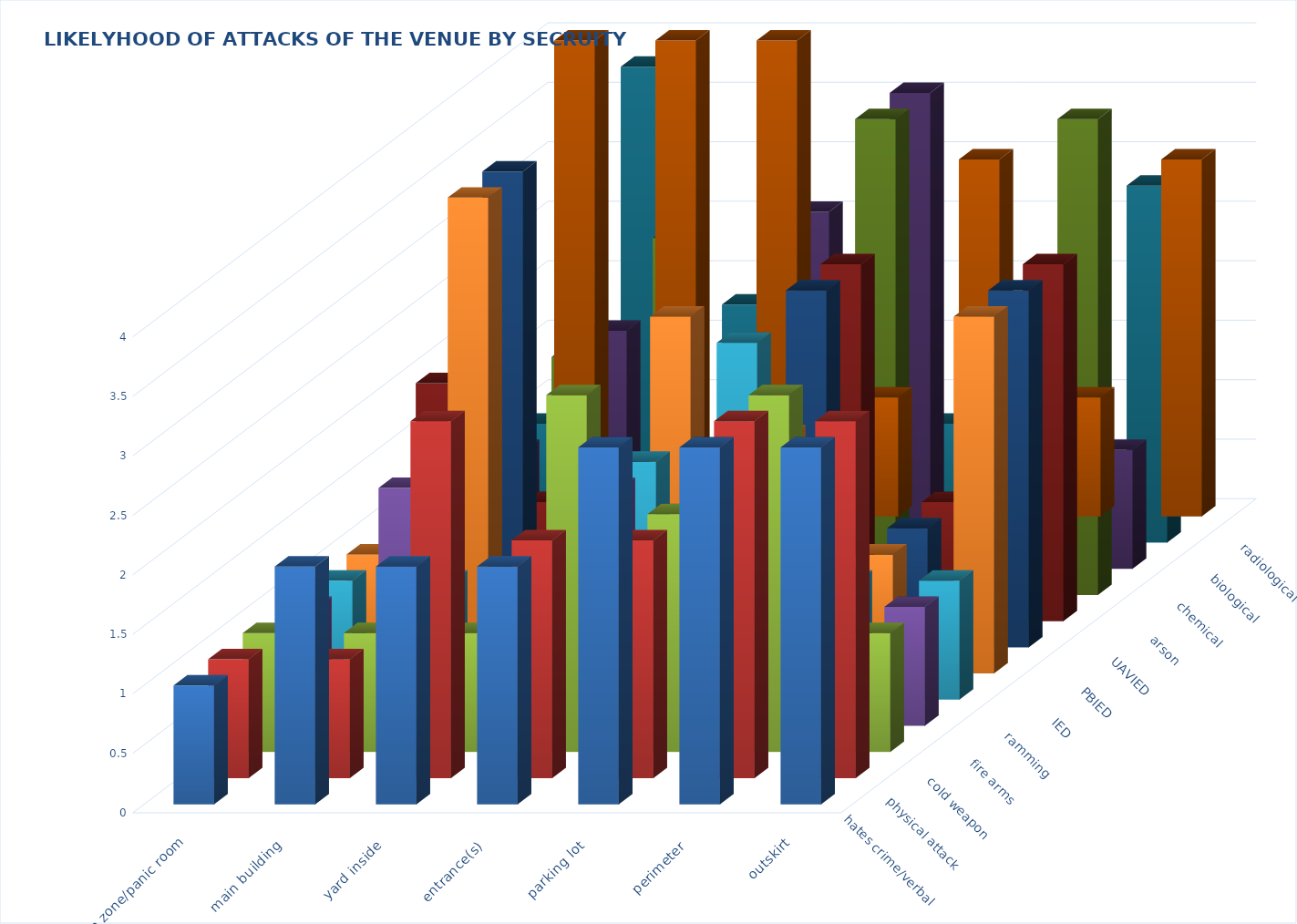
| Category | hates crime/verbal | physical attack | cold weapon | fire arms | ramming | IED | PBIED | UAVIED | arson | chemical | biological | radiological |
|---|---|---|---|---|---|---|---|---|---|---|---|---|
| safe zone/panic room | 1 | 1 | 1 | 1 | 1 | 1 | 1 | 2 | 4 | 1 | 1 | 1 |
| main building | 2 | 1 | 1 | 2 | 1 | 4 | 4 | 1 | 4 | 2 | 2 | 4 |
| yard inside | 2 | 3 | 1 | 1 | 1 | 1 | 1 | 1 | 4 | 3 | 1 | 2 |
| entrance(s) | 2 | 2 | 3 | 2 | 2 | 3 | 1 | 1 | 1 | 2 | 3 | 2 |
| parking lot | 3 | 2 | 2 | 1 | 3 | 2 | 3 | 3 | 3 | 4 | 4 | 1 |
| perimeter | 3 | 3 | 3 | 1 | 1 | 1 | 1 | 1 | 1 | 2 | 2 | 1 |
| outskirt | 3 | 3 | 1 | 1 | 1 | 3 | 3 | 3 | 3 | 4 | 1 | 3 |